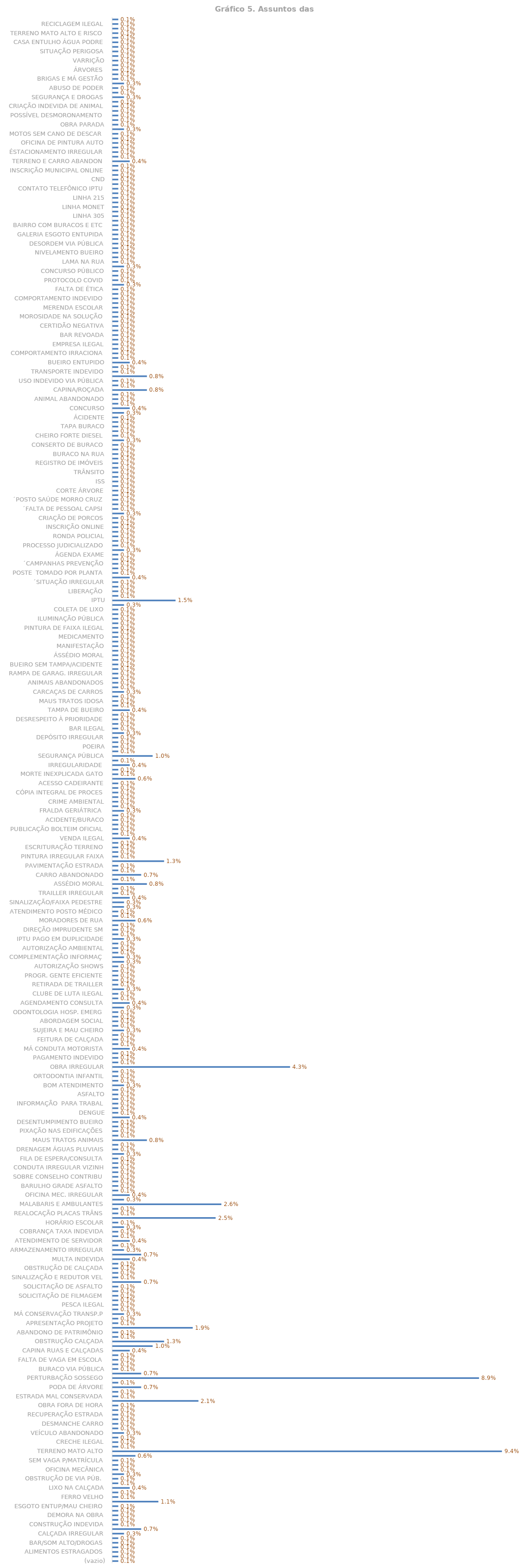
| Category | Total |
|---|---|
| (vazio) | 0.001 |
| FOCO DENGUE | 0.001 |
| ALIMENTOS ESTRAGADOS | 0.001 |
| AUX. ALIMENTAÇÃO | 0.001 |
| BAR/SOM ALTO/DROGAS | 0.001 |
| BORRACHARIA IRREGULAR | 0.001 |
| CALÇADA IRREGULAR | 0.003 |
| CARROS ABANDONADOS | 0.007 |
| CONSTRUÇÃO INDEVIDA | 0.001 |
| CRECHE IRREGULAR | 0.001 |
| DEMORA NA OBRA | 0.001 |
| DESOBSTRUÇÃO CAMINHO | 0.001 |
| ESGOTO ENTUP/MAU CHEIRO | 0.001 |
| ESTACIONAMENTO IRREGU | 0.011 |
| FERRO VELHO | 0.001 |
| INFORMAÇÃO PORTAL | 0.001 |
| LIXO NA CALÇADA | 0.004 |
| MORADOR DE RUA | 0.001 |
| OBSTRUÇÃO DE VIA PÚB.  | 0.001 |
| OFICINA IRREGULAR  | 0.003 |
| OFICINA MECÂNICA | 0.001 |
| SEGURANÇA  | 0.001 |
| SEM VAGA P/MATRÍCULA | 0.001 |
| SOBRE SERVIDOR | 0.006 |
| TERRENO MATO ALTO | 0.094 |
| VENDEDOR SEM LICENÇA | 0.001 |
| CRECHE ILEGAL | 0.001 |
| RETIRADA  PNEUS VELHOS | 0.001 |
| VEÍCULO ABANDONADO | 0.003 |
| BAR/SOM ALTO | 0.001 |
| DESMANCHE CARRO | 0.001 |
| INSTALAR REDUTOR VELOC. | 0.001 |
| RECUPERAÇÃO ESTRADA | 0.001 |
| RETIRADA DE TERRA | 0.001 |
| OBRA FORA DE HORA | 0.001 |
| TRANSPORTE COLETIVO | 0.021 |
| ESTRADA MAL CONSERVADA | 0.001 |
| MAUS TRATOS À IDOSA | 0.001 |
| PODA DE ÁRVORE | 0.007 |
| CARGA E DESCARGA INDEVIDA | 0.001 |
| PERTURBAÇÃO SOSSEGO | 0.089 |
| TRANSPORTE ESCOLAR | 0.007 |
| BURACO VIA PÚBLICA | 0.001 |
| OFICINA MECÂNICA IRREGULAR | 0.001 |
| FALTA DE VAGA EM ESCOLA | 0.001 |
| BUEIROS ÁGUAS PLUVIAIS | 0.001 |
| CAPINA RUAS E CALÇADAS | 0.004 |
| ENTULHO NA CALÇADA | 0.01 |
| OBSTRUÇÃO CALÇADA | 0.012 |
| AGRADECIMENTO RECEPÇÃO | 0.001 |
| ABANDONO DE PATRIMÔNIO | 0.001 |
| COMÉRCIO ILEGAL | 0.019 |
| APRESENTAÇÃO PROJETO | 0.001 |
| PONTE INTERDITADA | 0.001 |
| MÁ CONSERVAÇÃO TRANSP.P | 0.003 |
| CHAMINÉ MAL CONSTRUÍDA | 0.001 |
| PESCA ILEGAL | 0.001 |
| DESCARTE ILEGAL | 0.001 |
| SOLICITAÇÃO DE FILMAGEM | 0.001 |
| OFICINA AUTOMOTIVA | 0.001 |
| SOLICITAÇÃO DE ASFALTO | 0.001 |
| ACUMULADOR E RATOS | 0.007 |
| SINALIZAÇÃO E REDUTOR VEL | 0.001 |
| REFORMA PARQUE/BRINQUEDO | 0.001 |
| OBSTRUÇÃO DE CALÇADA | 0.001 |
| LIMPEZA RIO SESMARIA | 0.001 |
| MULTA INDEVIDA | 0.004 |
| CASA ABANDONADA MATO | 0.007 |
| ARMAZENAMENTO IRREGULAR | 0.003 |
| CALÇAMENTO BEIRA RIO | 0.001 |
| ATENDIMENTO DE SERVIDOR | 0.004 |
| FEIRA LIVRE | 0.001 |
| COBRANÇA TAXA INDEVIDA | 0.001 |
| LIXO LOCAL PROIBIDO | 0.003 |
| HORÁRIO ESCOLAR | 0.001 |
| MÁ CONDUTA SERVIDOR | 0.025 |
| REALOCAÇÃO PLACAS TRÂNS | 0.001 |
| FALTA DE PLANEJ. HTP | 0.001 |
| MALABARIS E AMBULANTES | 0.026 |
| OFICINA PINTURA AUTOMÓVEL | 0.003 |
| OFICINA MEC. IRREGULAR | 0.004 |
| LENTIDÃO PROCESSO | 0.001 |
| BARULHO GRADE ASFALTO | 0.001 |
| HORÁRIO DE ÔNIBUS | 0.001 |
| SOBRE CONSELHO CONTRIBU | 0.001 |
| HÁBITO DE QUEIMAR LIXO | 0.001 |
| CONDUTA IRREGULAR VIZINH | 0.001 |
| TAMPA E LIMPEZA DE BUEIRO | 0.001 |
| FILA DE ESPERA/CONSULTA | 0.001 |
| INVASÃO TERRENO | 0.003 |
| DRENAGEM ÁGUAS PLUVIAIS | 0.001 |
| FOGO NO LIXO | 0.001 |
| MAUS TRATOS ANIMAIS | 0.008 |
| ATIVIVIDADE S/LICENÇA AMBIEN | 0.001 |
| PIXAÇÃO NAS EDIFICAÇÕES | 0.001 |
| FALTA DE MÉDICO | 0.001 |
| DESENTUMPIMENTO BUEIRO | 0.001 |
| SAÚDE PÚBLICA | 0.004 |
| DENGUE | 0.001 |
| CARROS NA CALÇADA | 0.001 |
| INFORMAÇÃO  PARA TRABAL | 0.001 |
| SEM CAPINA/VARRIÇÃO | 0.001 |
| ASFALTO | 0.001 |
| SITUAÇÃO IRREGULAR | 0.001 |
| BOM ATENDIMENTO | 0.003 |
| OBRA BARULHENTA | 0.001 |
| ORTODONTIA INFANTIL | 0.001 |
| AVALIAÇÃO DE ÁRVORE | 0.001 |
| OBRA IRREGULAR | 0.043 |
| JETON INDEVIDO | 0.001 |
| PAGAMENTO INDEVIDO | 0.001 |
| FICHA DE ATENDIMENTO | 0.001 |
| MÁ CONDUTA MOTORISTA | 0.004 |
| CIRURGIA | 0.001 |
| FEITURA DE CALÇADA | 0.001 |
| FALTA DE CANETA DE INSULIN | 0.001 |
| SUJEIRA E MAU CHEIRO | 0.003 |
| AUSÊNCIA DE VARRIÇÃO | 0.001 |
| ABORDAGEM SOCIAL | 0.001 |
| ANIMAIS PERIGOSOS CIEP SUR | 0.001 |
| ODONTOLOGIA HOSP. EMERG | 0.001 |
| VANTAGEM PECUNIÁRIA | 0.003 |
| AGENDAMENTO CONSULTA | 0.004 |
| ATUALIZAÇÃO CADASTRO | 0.001 |
| CLUBE DE LUTA ILEGAL | 0.001 |
| SONEGAÇÃO IMPOSTO/CX2 | 0.003 |
| RETIRADA DE TRAILLER | 0.001 |
| REDUTOR VELOCIDADE  | 0.001 |
| PROGR. GENTE EFICIENTE | 0.001 |
| FISCALIZAÇÃO POSTO COMBUS | 0.001 |
| AUTORIZAÇÃO SHOWS | 0.001 |
| UTILIZAÇÃO INDEVIDA CALÇAD | 0.003 |
| COMPLEMENTAÇÃO INFORMAÇ | 0.003 |
| LIMPEZA/ROÇADA/VARRIÇÃO | 0.001 |
| AUTORIZAÇÃO AMBIENTAL | 0.001 |
| EXCELENTE ATENDIMENTO | 0.001 |
| IPTU PAGO EM DUPLICIDADE | 0.003 |
| TROCA TITULAR IPTU | 0.001 |
| DIREÇÃO IMPRUDENTE SM | 0.001 |
| ERRO VACINAL | 0.001 |
| MORADORES DE RUA | 0.006 |
| NÃO RETENÇÃO DO INSS | 0.001 |
| ATENDIMENTO POSTO MÉDICO | 0.001 |
| NOTA FISCAL | 0.003 |
| SINALIZAÇÃO/FAIXA PEDESTRE | 0.003 |
| VAZAMENTO ESGOTO | 0.004 |
| TRAILLER IRREGULAR | 0.001 |
| VAGA EM ESCOLA | 0.001 |
| ASSÉDIO MORAL | 0.008 |
| INSCRIÇÃO E ALVARÁ | 0.001 |
| CARRO ABANDONADO | 0.007 |
| AUSÊNCIA DE ALCOOL GEL | 0.001 |
| PAVIMENTAÇÃO ESTRADA | 0.001 |
| COMERCIO ILEGAL | 0.012 |
| PINTURA IRREGULAR FAIXA | 0.001 |
| SEM INFORMAÇÃO SUFICIENTE | 0.001 |
| ESCRITURAÇÃO TERRENO | 0.001 |
| IMPRESSORA COM DEFEITO | 0.001 |
| VENDA ILEGAL | 0.004 |
| MOTO ELÉTRICA | 0.001 |
| PUBLICAÇÃO BOLTEIM OFICIAL | 0.001 |
| CRIANÇA FICA SOZINHA  | 0.001 |
| ACIDENTE/BURACO | 0.001 |
| VIABILIDADE | 0.001 |
| FRALDA GERIÁTRICA  | 0.003 |
| COMPROVANTE PAG.ITBI | 0.001 |
| CRIME AMBIENTAL | 0.001 |
| DESMATAMENTO | 0.001 |
| CÓPIA INTEGRAL DE PROCES | 0.001 |
| PÉSSIMO ATENDIMENTO PSF | 0.001 |
| ACESSO CADEIRANTE | 0.001 |
| DESENTUPIMENTO BUEIRO | 0.006 |
| MORTE INEXPLICADA GATO | 0.001 |
| CADASTRAMENTO EMPRESA | 0.001 |
| IRREGULARIDADE  | 0.004 |
| FALTA DE CABECEIRA MANILHA | 0.001 |
| SEGURANÇA PÚBLICA | 0.01 |
| MÁ CONDUTA MOTORISTA SM | 0.001 |
| POEIRA | 0.001 |
| SEM ACESSO À ASSISTÊNCIA | 0.001 |
| DEPÓSITO IRREGULAR | 0.001 |
| CONSTRUÇÃO IRREGULAR | 0.003 |
| BAR ILEGAL | 0.001 |
| PROFISSIONALISMO DENTISTA | 0.001 |
| DESRESPEITO À PRIORIDADE | 0.001 |
| CARNÊ IPTU | 0.001 |
| TAMPA DE BUEIRO | 0.004 |
| RETIRADA DE TELHAS SOLTAS | 0.001 |
| MAUS TRATOS IDOSA | 0.001 |
| OBSTRUÇÃO CALÇADA ARBUS | 0.001 |
| CARCAÇAS DE CARROS | 0.003 |
| ´SERVIDORES CASA ABERTA | 0.001 |
| ANIMAIS ABANDONADOS | 0.001 |
| QUINTAL SUJO E MAL CHEIRO | 0.001 |
| RAMPA DE GARAG. IRREGULAR | 0.001 |
| OBRA FORA DE HORÁRIO | 0.001 |
| BUEIRO SEM TAMPA/ACIDENTE | 0.001 |
| POSTE S/LUZ | 0.001 |
| ÁSSÉDIO MORAL | 0.001 |
| ´RECOLHER ANIMAL DOENTE | 0.001 |
| MANIFESTAÇÃO | 0.001 |
| PATRIMÔNIO HISTÓRICO | 0.001 |
| MEDICAMENTO | 0.001 |
| COBRANÇA DE TAXA | 0.001 |
| PINTURA DE FAIXA ILEGAL | 0.001 |
| FRAUDE | 0.001 |
| ILUMINAÇÃO PÚBLICA | 0.001 |
| DEMORA NO ATENDIMENTO | 0.001 |
| COLETA DE LIXO | 0.001 |
| VARRIÇÃO  | 0.003 |
| IPTU | 0.015 |
| MAU ATENDIMENTO SERVIDOR | 0.001 |
| LIBERAÇÃO  | 0.001 |
| CAMP/ATEND.PREVEN.CANCER | 0.001 |
| ´SITUAÇÃO IRREGULAR | 0.001 |
| ´MÁ CONDUTA SERVIDOR | 0.004 |
| POSTE  TOMADO POR PLANTA | 0.001 |
| COLETA SANGUE HEMONÚCL | 0.001 |
| ´CAMPANHAS PREVENÇÃO | 0.001 |
| DESCARTE ÁREA PRESERVAÇ | 0.001 |
| ÁGENDA EXAME | 0.001 |
| LIMPEZA OBRAS E BUEIRO | 0.003 |
| PROCESSO JUDICIALIZADO | 0.001 |
| PARECER | 0.001 |
| RONDA POLICIAL | 0.001 |
| DRENAGEM | 0.001 |
| INSCRIÇÃO ONLINE | 0.001 |
| REPARO NA PONTE | 0.001 |
| CRIAÇÃO DE PORCOS | 0.001 |
| SOLICITAÇÃO ATENDIDA | 0.003 |
| ´FALTA DE PESSOAL CAPSI | 0.001 |
| ´DEMORA CIRURGIA | 0.001 |
| ´POSTO SAÚDE MORRO CRUZ | 0.001 |
| ÁTENDIMENTO FISIOTERAPEU | 0.001 |
| CORTE ÁRVORE | 0.001 |
| POLICIAIS NOS SINAIS DE TRAN | 0.001 |
| ISS | 0.001 |
| RAMPA IRREGULAR | 0.001 |
| TRÂNSITO | 0.001 |
| DESCARTE PNEUS | 0.001 |
| REGISTRO DE IMÓVEIS | 0.001 |
| ´CONSULTA PSICÓLOGO | 0.001 |
| BURACO NA RUA | 0.001 |
| PORTÃO RETIRADO | 0.001 |
| CONSERTO DE BURACO | 0.001 |
| PAVIMENTAÇÃO  | 0.003 |
| CHEIRO FORTE DIESEL | 0.001 |
| RETORNO ÁGUA | 0.001 |
| TAPA BURACO | 0.001 |
| POLUIÇÃO SONORA | 0.001 |
| ÁCIDENTE | 0.001 |
| OCUPAÇÃO ILEGAL | 0.003 |
| CONCURSO | 0.004 |
| DIREÇÃO ESCOLAR | 0.001 |
| ANIMAL ABANDONADO | 0.001 |
| PONTO DE ONIBUS | 0.001 |
| CAPINA/ROÇADA | 0.008 |
| INVASÃO DE TERRENO PÚBLI | 0.001 |
| USO INDEVIDO VIA PÚBLICA | 0.001 |
| CRIAÇÃO DE ANIMAIS | 0.008 |
| TRANSPORTE INDEVIDO | 0.001 |
| ATENDIMENTO LENTO | 0.001 |
| BUEIRO ENTUPIDO | 0.004 |
| CRIAÇÃO DE GALINHA | 0.001 |
| COMPORTAMENTO IRRACIONA | 0.001 |
| INSEGURANÇA NA ESCOLA | 0.001 |
| EMPRESA ILEGAL | 0.001 |
| ÁGUAS PLUVIAIS | 0.001 |
| BAR REVOADA | 0.001 |
| SOBRE ALVARÁ MEI | 0.001 |
| CERTIDÃO NEGATIVA | 0.001 |
| CADASTRO | 0.001 |
| MOROSIDADE NA SOLUÇÃO | 0.001 |
| DESCARTE CORRETO | 0.001 |
| MERENDA ESCOLAR | 0.001 |
| HOSPITAL VETERINÁRIO | 0.001 |
| COMPORTAMENTO INDEVIDO | 0.001 |
| DESRATIZAÇÃO | 0.001 |
| FALTA DE ÉTICA | 0.001 |
| VACINAÇÃO | 0.003 |
| PROTOCOLO COVID | 0.001 |
| ÁRVORE CAÍDA | 0.001 |
| CONCURSO PÚBLICO | 0.001 |
| RETIRADA ENTULHOS | 0.003 |
| LAMA NA RUA | 0.001 |
| TRANSTORNO DE OBRA | 0.001 |
| NIVELAMENTO BUEIRO | 0.001 |
| VAMENTO ESGOTO | 0.001 |
| DESORDEM VIA PÚBLICA | 0.001 |
| MARMORARIA | 0.001 |
| GALERIA ESGOTO ENTUPIDA | 0.001 |
| ÁGUA EMPOÇADA | 0.001 |
| BAIRRO COM BURACOS E ETC | 0.001 |
| MAIS LINHAS DE ÔNIBUS | 0.001 |
| LINHA 305 | 0.001 |
| LINHA 340 | 0.001 |
| LINHA MONET | 0.001 |
| LINHA 180 | 0.001 |
| LINHA 215 | 0.001 |
| CONSTRUÇÃO DE CALÇADA | 0.001 |
| CONTATO TELEFÔNICO IPTU | 0.001 |
| EDITAL | 0.001 |
| CND | 0.001 |
| VAGAS DE EMPREGO | 0.001 |
| INSCRIÇÃO MUNICIPAL ONLINE | 0.001 |
| MÁ CONDUTA PROFISSIONAL | 0.001 |
| TERRENO E CARRO ABANDON | 0.004 |
| CALÇAMENTO | 0.001 |
| ÉSTACIONAMENTO IRREGULAR | 0.001 |
| CULTO RELIGIOSO | 0.001 |
| OFICINA DE PINTURA AUTO | 0.001 |
| POLICIAMENTO NO SINAIS | 0.001 |
| MOTOS SEM CANO DE DESCAR | 0.001 |
| OBRA PERIGOSA | 0.003 |
| OBRA PARADA | 0.001 |
| REPARO BUEIRO | 0.001 |
| POSSÍVEL DESMORONAMENTO | 0.001 |
| DANIFICAÇÃO DE PAVIMENTAÇ | 0.001 |
| CRIAÇÃO INDEVIDA DE ANIMAL | 0.001 |
| REPARO MURO ESCOLA | 0.001 |
| SEGURANÇA E DROGAS | 0.003 |
| CALOR EXCESSIVO SALAS  | 0.001 |
| ABUSO DE PODER | 0.001 |
| AUTORITARISMO | 0.003 |
| BRIGAS E MÁ GESTÃO | 0.001 |
| ARBORIZAÇÃO | 0.001 |
| ÁRVORES  | 0.001 |
| TERRENO MATO ALTO E SUJO | 0.001 |
| VARRIÇÃO | 0.001 |
| CORTE DE ÁRVORES | 0.001 |
| SITUAÇÃO PERIGOSA | 0.001 |
| VAZAMENTO E INFILTRAÇÃO | 0.001 |
| CASA ENTULHO ÁGUA PODRE | 0.001 |
| LIMPEZA DE CANAL | 0.001 |
| TERRENO MATO ALTO E RISCO | 0.001 |
| OFICINA IRREGULAR | 0.001 |
| RECICLAGEM ILEGAL | 0.001 |
| IMÓVEL ABANDONADO MATO | 0.001 |